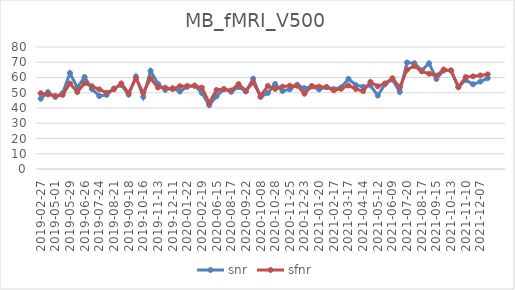
| Category | snr | sfnr |
|---|---|---|
| 2019-02-27 | 46.099 | 49.675 |
| 2019-04-03 | 50.358 | 48.905 |
| 2019-05-01 | 47.243 | 47.873 |
| 2019-05-15 | 49.707 | 48.575 |
| 2019-05-29 | 62.908 | 56.077 |
| 2019-06-12 | 53.31 | 50.439 |
| 2019-06-26 | 60.285 | 56.342 |
| 2019-07-08 | 52.454 | 54.242 |
| 2019-07-24 | 47.863 | 52.256 |
| 2019-08-07 | 48.623 | 49.999 |
| 2019-08-21 | 52.822 | 52.238 |
| 2019-09-04 | 55.11 | 56.106 |
| 2019-09-18 | 48.754 | 49.803 |
| 2019-10-04 | 60.599 | 59.389 |
| 2019-10-16 | 47.256 | 49.949 |
| 2019-10-30 | 64.409 | 59.371 |
| 2019-11-13 | 55.863 | 53.445 |
| 2019-11-27 | 51.898 | 53.321 |
| 2019-12-11 | 53.028 | 52.409 |
| 2020-01-08 | 50.811 | 54.29 |
| 2020-01-22 | 53.898 | 54.437 |
| 2020-02-05 | 54.725 | 54.536 |
| 2020-02-19 | 49.814 | 53.339 |
| 2020-03-04 | 41.839 | 43.399 |
| 2020-06-15 | 47.695 | 51.802 |
| 2020-07-20 | 52.34 | 52.42 |
| 2020-08-17 | 50.644 | 51.464 |
| 2020-09-01 | 53.763 | 55.704 |
| 2020-09-22 | 50.817 | 51.317 |
| 2020-10-02 | 59.176 | 56.803 |
| 2020-10-08 | 47.19 | 47.929 |
| 2020-10-14 | 49.89 | 54.487 |
| 2020-10-28 | 55.727 | 52.544 |
| 2020-11-09 | 51.148 | 54.017 |
| 2020-11-25 | 52.279 | 54.628 |
| 2020-12-09 | 55.261 | 54.644 |
| 2020-12-23 | 52.976 | 49.372 |
| 2021-01-06 | 54.082 | 54.456 |
| 2021-01-20 | 52.188 | 54.016 |
| 2021-02-04 | 53.775 | 53.598 |
| 2021-02-17 | 52.427 | 51.576 |
| 2021-03-03 | 53.463 | 52.629 |
| 2021-03-17 | 59.104 | 54.75 |
| 2021-03-31 | 55.077 | 52.492 |
| 2021-04-14 | 53.92 | 51.012 |
| 2021-04-28 | 54.824 | 57.146 |
| 2021-05-12 | 48.173 | 54.246 |
| 2021-05-26 | 55.702 | 56.116 |
| 2021-06-09 | 58.627 | 59.488 |
| 2021-07-01 | 50.582 | 53.543 |
| 2021-07-20 | 69.816 | 65.131 |
| 2021-08-03 | 69.342 | 67.535 |
| 2021-08-17 | 64.583 | 64.014 |
| 2021-08-31 | 69.345 | 62.478 |
| 2021-09-15 | 59.051 | 61.223 |
| 2021-10-04 | 64.624 | 65.25 |
| 2021-10-13 | 64.606 | 64.555 |
| 2021-10-28 | 53.867 | 53.571 |
| 2021-11-10 | 58.312 | 60.279 |
| 2021-11-22 | 55.553 | 60.776 |
| 2021-12-07 | 57.297 | 61.364 |
| 2021-12-20 | 59.556 | 62.044 |